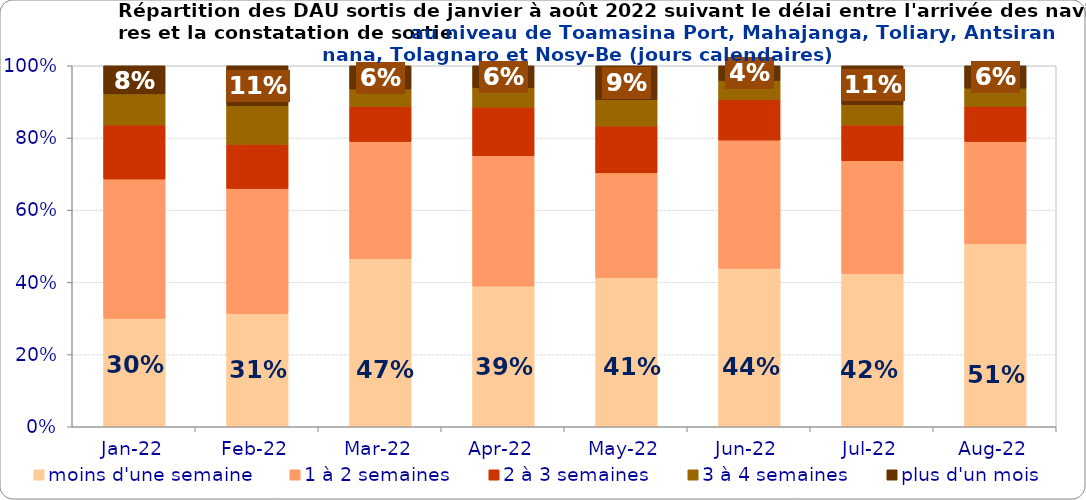
| Category | moins d'une semaine | 1 à 2 semaines | 2 à 3 semaines | 3 à 4 semaines | plus d'un mois |
|---|---|---|---|---|---|
| 2022-01-01 | 0.3 | 0.386 | 0.149 | 0.087 | 0.078 |
| 2022-02-01 | 0.314 | 0.346 | 0.122 | 0.107 | 0.111 |
| 2022-03-01 | 0.465 | 0.325 | 0.097 | 0.048 | 0.065 |
| 2022-04-01 | 0.39 | 0.361 | 0.135 | 0.054 | 0.061 |
| 2022-05-01 | 0.413 | 0.29 | 0.13 | 0.073 | 0.094 |
| 2022-06-01 | 0.439 | 0.355 | 0.112 | 0.053 | 0.041 |
| 2022-07-01 | 0.424 | 0.313 | 0.099 | 0.056 | 0.108 |
| 2022-08-01 | 0.507 | 0.283 | 0.097 | 0.051 | 0.062 |